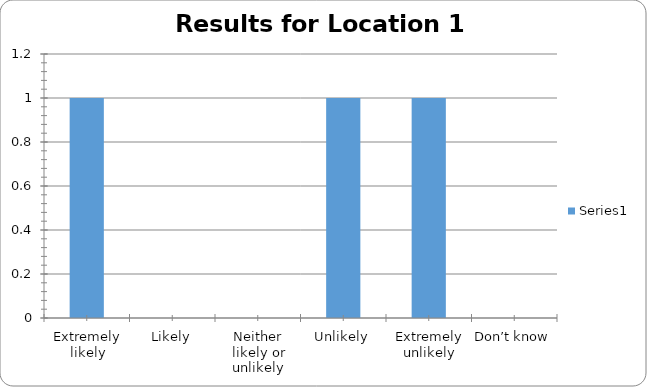
| Category | Series 0 |
|---|---|
| Extremely likely | 1 |
| Likely | 0 |
| Neither likely or unlikely | 0 |
| Unlikely | 1 |
| Extremely unlikely | 1 |
| Don’t know | 0 |